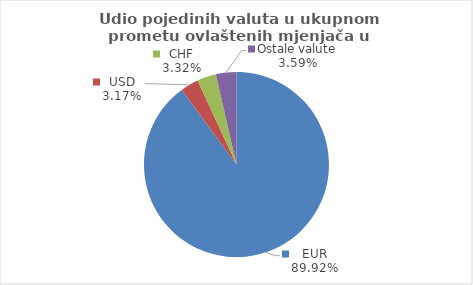
| Category | Series 0 |
|---|---|
| EUR | 89.917 |
| USD | 3.173 |
| CHF | 3.316 |
| Ostale valute | 3.594 |